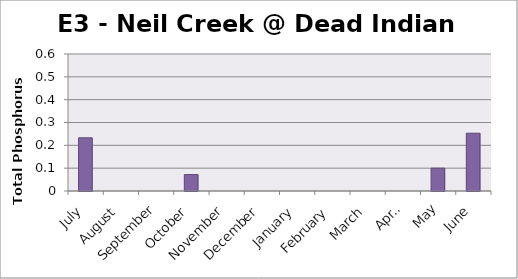
| Category | Phosphorus (mg/L) |
|---|---|
| July | 0.233 |
| August | 0 |
| September | 0 |
| October | 0.072 |
| November | 0 |
| December | 0 |
| January | 0 |
| February | 0 |
| March | 0 |
| April | 0 |
| May | 0.1 |
| June | 0.253 |